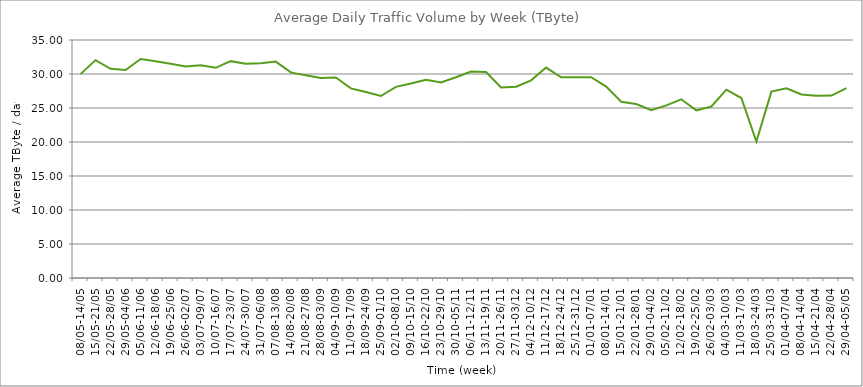
| Category | Average |
|---|---|
| 08/05-14/05 | 29.98 |
| 15/05-21/05 | 32.04 |
| 22/05-28/05 | 30.76 |
| 29/05-04/06 | 30.59 |
| 05/06-11/06 | 32.2 |
| 12/06-18/06 | 31.86 |
| 19/06-25/06 | 31.52 |
| 26/06-02/07 | 31.12 |
| 03/07-09/07 | 31.29 |
| 10/07-16/07 | 30.91 |
| 17/07-23/07 | 31.89 |
| 24/07-30/07 | 31.51 |
| 31/07-06/08 | 31.58 |
| 07/08-13/08 | 31.82 |
| 14/08-20/08 | 30.24 |
| 21/08-27/08 | 29.8 |
| 28/08-03/09 | 29.42 |
| 04/09-10/09 | 29.5 |
| 11/09-17/09 | 27.89 |
| 18/09-24/09 | 27.35 |
| 25/09-01/10 | 26.76 |
| 02/10-08/10 | 28.11 |
| 09/10-15/10 | 28.6 |
| 16/10-22/10 | 29.16 |
| 23/10-29/10 | 28.77 |
| 30/10-05/11 | 29.52 |
| 06/11-12/11 | 30.36 |
| 13/11-19/11 | 30.29 |
| 20/11-26/11 | 28.01 |
| 27/11-03/12 | 28.14 |
| 04/12-10/12 | 29.07 |
| 11/12-17/12 | 30.94 |
| 18/12-24/12 | 29.52 |
| 25/12-31/12 | 29.54 |
| 01/01-07/01 | 29.54 |
| 08/01-14/01 | 28.15 |
| 15/01-21/01 | 25.92 |
| 22/01-28/01 | 25.58 |
| 29/01-04/02 | 24.69 |
| 05/02-11/02 | 25.39 |
| 12/02-18/02 | 26.28 |
| 19/02-25/02 | 24.65 |
| 26/02-03/03 | 25.22 |
| 04/03-10/03 | 27.7 |
| 11/03-17/03 | 26.47 |
| 18/03-24/03 | 20.06 |
| 25/03-31/03 | 27.41 |
| 01/04-07/04 | 27.91 |
| 08/04-14/04 | 27 |
| 15/04-21/04 | 26.81 |
| 22/04-28/04 | 26.83 |
| 29/04-05/05 | 27.91 |